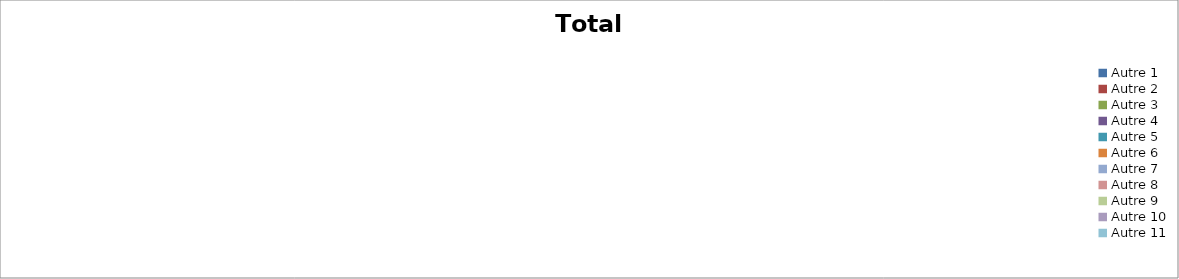
| Category | Total PANB |
|---|---|
| Autre 1 | 0 |
| Autre 2 | 0 |
| Autre 3 | 0 |
| Autre 4 | 0 |
| Autre 5 | 0 |
| Autre 6 | 0 |
| Autre 7 | 0 |
| Autre 8 | 0 |
| Autre 9 | 0 |
| Autre 10 | 0 |
| Autre 11 | 0 |